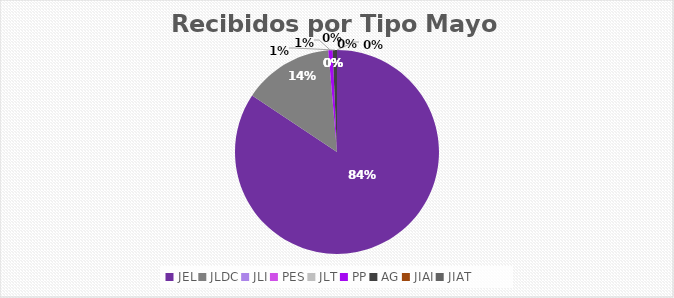
| Category | Series 0 |
|---|---|
| JEL | 124 |
| JLDC | 21 |
| JLI | 0 |
| PES | 0 |
| JLT | 0 |
| PP | 1 |
| AG | 1 |
| JIAI | 0 |
| JIAT | 0 |